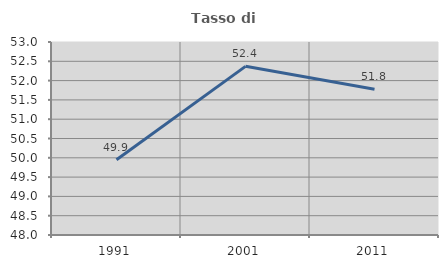
| Category | Tasso di occupazione   |
|---|---|
| 1991.0 | 49.948 |
| 2001.0 | 52.369 |
| 2011.0 | 51.777 |